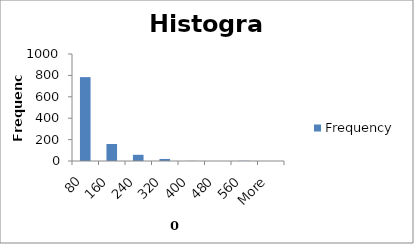
| Category | Frequency |
|---|---|
| 80 | 784 |
| 160 | 159 |
| 240 | 58 |
| 320 | 19 |
| 400 | 1 |
| 480 | 0 |
| 560 | 2 |
| More | 0 |